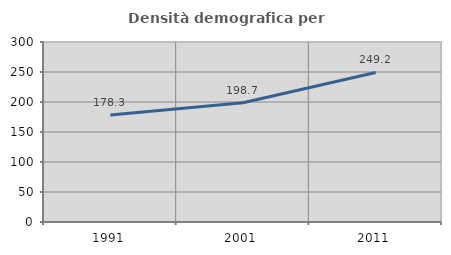
| Category | Densità demografica |
|---|---|
| 1991.0 | 178.342 |
| 2001.0 | 198.704 |
| 2011.0 | 249.194 |